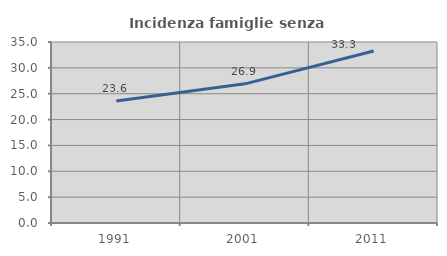
| Category | Incidenza famiglie senza nuclei |
|---|---|
| 1991.0 | 23.575 |
| 2001.0 | 26.91 |
| 2011.0 | 33.252 |